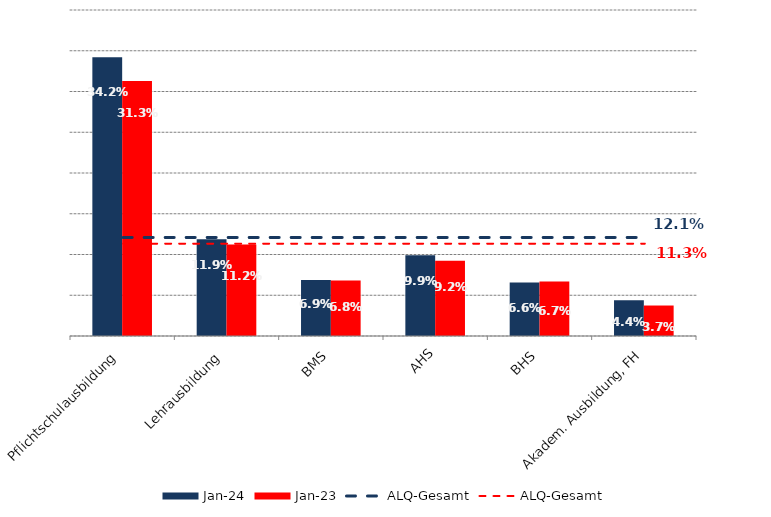
| Category | Jan 24 | Jan 23 |
|---|---|---|
| Pflichtschulausbildung | 0.342 | 0.313 |
| Lehrausbildung | 0.119 | 0.112 |
| BMS | 0.069 | 0.068 |
| AHS | 0.099 | 0.092 |
| BHS | 0.066 | 0.067 |
| Akadem. Ausbildung, FH | 0.044 | 0.037 |